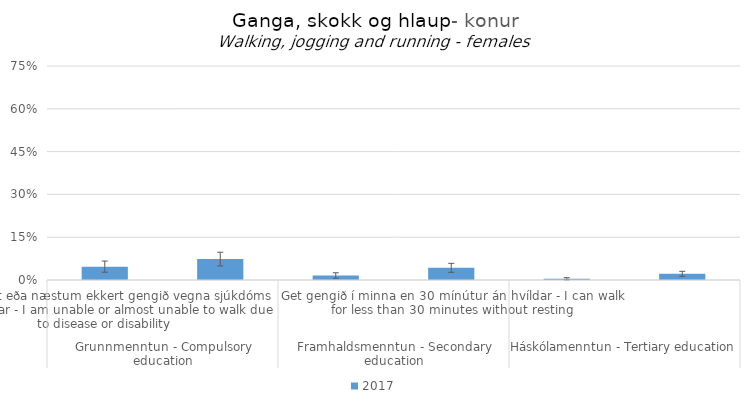
| Category | 2017 |
|---|---|
| 0 | 0.047 |
| 1 | 0.073 |
| 2 | 0.016 |
| 3 | 0.043 |
| 4 | 0.004 |
| 5 | 0.022 |